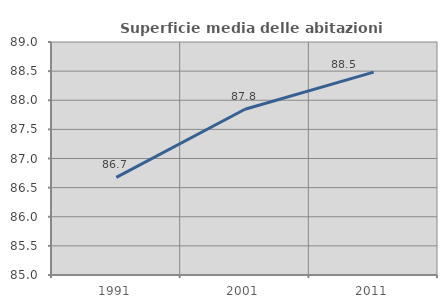
| Category | Superficie media delle abitazioni occupate |
|---|---|
| 1991.0 | 86.675 |
| 2001.0 | 87.846 |
| 2011.0 | 88.483 |